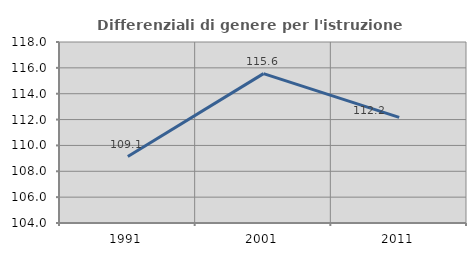
| Category | Differenziali di genere per l'istruzione superiore |
|---|---|
| 1991.0 | 109.138 |
| 2001.0 | 115.556 |
| 2011.0 | 112.167 |